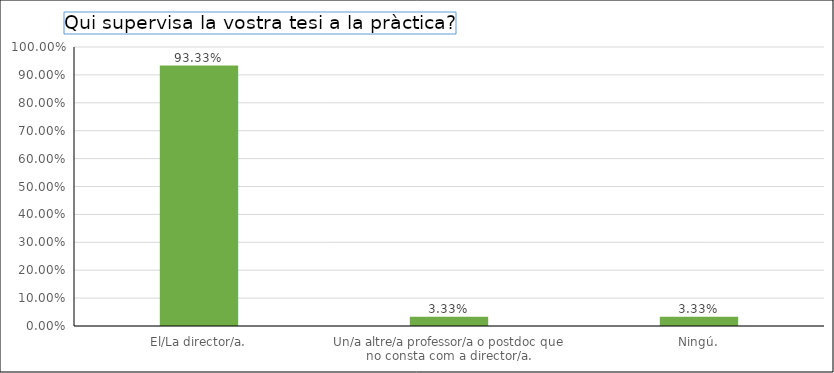
| Category | Series 0 |
|---|---|
| El/La director/a. | 0.933 |
| Un/a altre/a professor/a o postdoc que no consta com a director/a. | 0.033 |
| Ningú. | 0.033 |